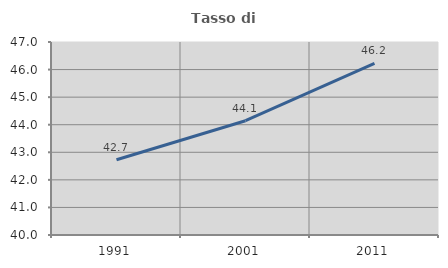
| Category | Tasso di occupazione   |
|---|---|
| 1991.0 | 42.728 |
| 2001.0 | 44.145 |
| 2011.0 | 46.225 |